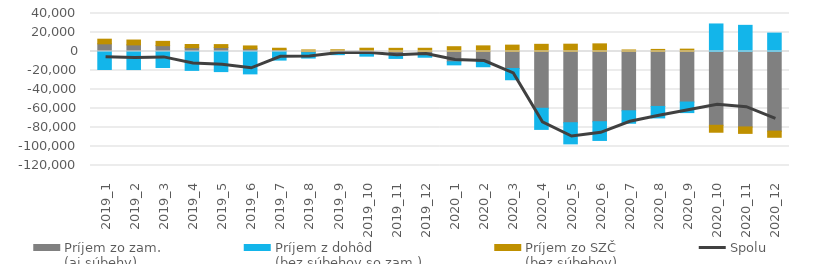
| Category | Príjem zo zam. 
(aj súbehy) | Príjem z dohôd 
(bez súbehov so zam.) | Príjem zo SZČ 
(bez súbehov) |
|---|---|---|---|
| 2019_1 | 8077 | -18926 | 4882 |
| 2019_2 | 6956 | -19003 | 5111 |
| 2019_3 | 6158 | -16878 | 4516 |
| 2019_4 | 3972 | -19887 | 3373 |
| 2019_5 | 4134 | -21163 | 3143 |
| 2019_6 | 2821 | -23555 | 3032 |
| 2019_7 | 1700 | -9049 | 1728 |
| 2019_8 | -1259 | -5637 | 1646 |
| 2019_9 | -130 | -3202 | 1799 |
| 2019_10 | -1555 | -3340 | 3453 |
| 2019_11 | -3311 | -3969 | 3347 |
| 2019_12 | -3014 | -3011 | 3400 |
| 2020_1 | -10829 | -3239 | 5041 |
| 2020_2 | -11054 | -4993 | 5931 |
| 2020_3 | -17893 | -11848 | 6705 |
| 2020_4 | -59780 | -22229 | 7556 |
| 2020_5 | -74977 | -22243 | 7702 |
| 2020_6 | -73916 | -19714 | 8045 |
| 2020_7 | -62416 | -13117 | 1612 |
| 2020_8 | -57839 | -12078 | 2201 |
| 2020_9 | -53198 | -11122 | 2492 |
| 2020_10 | -77656 | 28988 | -7327 |
| 2020_11 | -79417 | 27533 | -6773 |
| 2020_12 | -83818 | 19382 | -6473 |